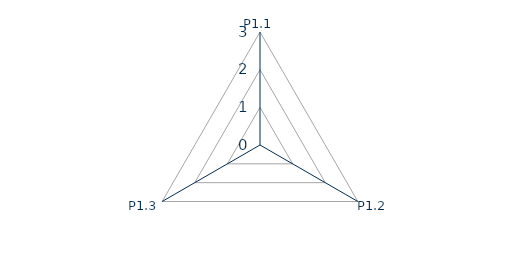
| Category | E01 |
|---|---|
| P1.1 | 0 |
| P1.2 | 0 |
| P1.3 | 0 |